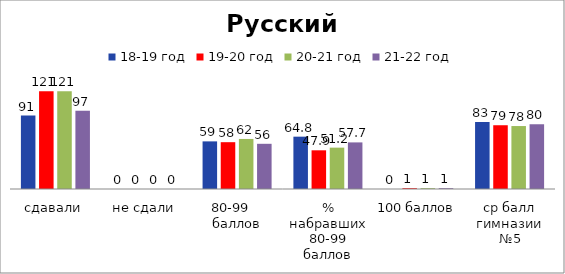
| Category | 18-19 год | 19-20 год | 20-21 год | 21-22 год |
|---|---|---|---|---|
| сдавали | 91 | 121 | 121 | 97 |
| не сдали | 0 | 0 | 0 | 0 |
| 80-99    баллов | 59 | 58 | 62 | 56 |
| % набравших 80-99 баллов | 64.835 | 47.934 | 51.24 | 57.732 |
| 100 баллов | 0 | 1 | 1 | 1 |
| ср балл гимназии №5 | 83 | 79 | 78 | 80.3 |